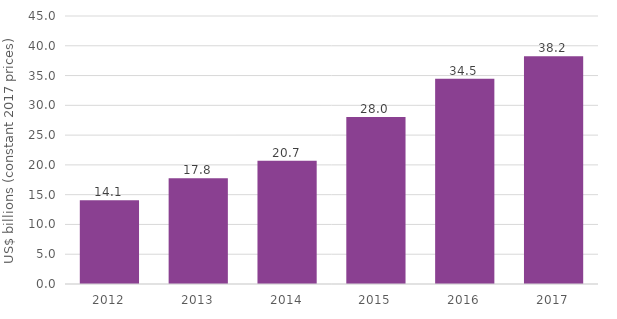
| Category | Series 0 |
|---|---|
| 2012.0 | 14081.218 |
| 2013.0 | 17758.861 |
| 2014.0 | 20713.557 |
| 2015.0 | 28023.23 |
| 2016.0 | 34472.593 |
| 2017.0 | 38242.562 |